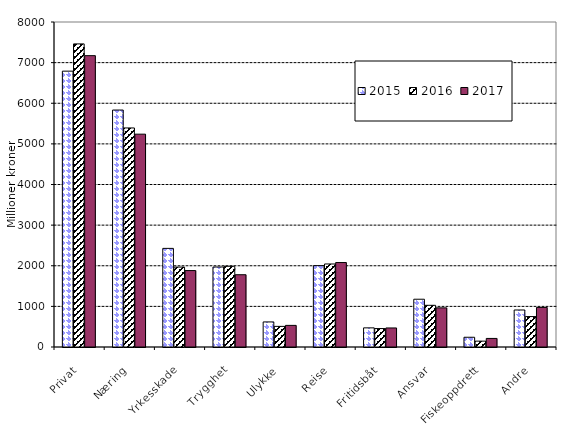
| Category | 2015 | 2016 | 2017 |
|---|---|---|---|
| Privat | 6790.108 | 7461.039 | 7171.79 |
| Næring | 5832.965 | 5391.97 | 5239.137 |
| Yrkesskade | 2427.398 | 1966.977 | 1881.452 |
| Trygghet | 1969.218 | 1986.795 | 1779.099 |
| Ulykke | 617.196 | 507.423 | 531.976 |
| Reise | 2002.965 | 2043.508 | 2078.892 |
| Fritidsbåt | 470.834 | 453.982 | 468.766 |
| Ansvar | 1175.94 | 1026.439 | 963.648 |
| Fiskeoppdrett | 239.901 | 144.281 | 211.046 |
| Andre | 910.879 | 749.461 | 973.926 |